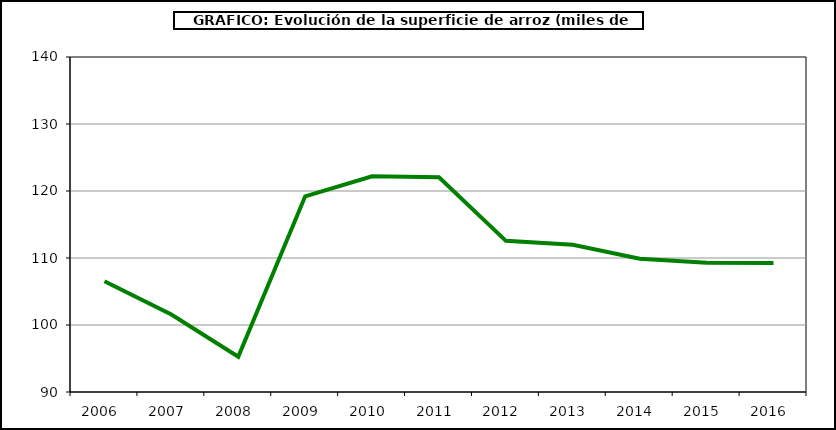
| Category | Superficie |
|---|---|
| 2006.0 | 106.535 |
| 2007.0 | 101.565 |
| 2008.0 | 95.27 |
| 2009.0 | 119.202 |
| 2010.0 | 122.184 |
| 2011.0 | 122.058 |
| 2012.0 | 112.557 |
| 2013.0 | 111.984 |
| 2014.0 | 109.889 |
| 2015.0 | 109.29 |
| 2016.0 | 109.272 |